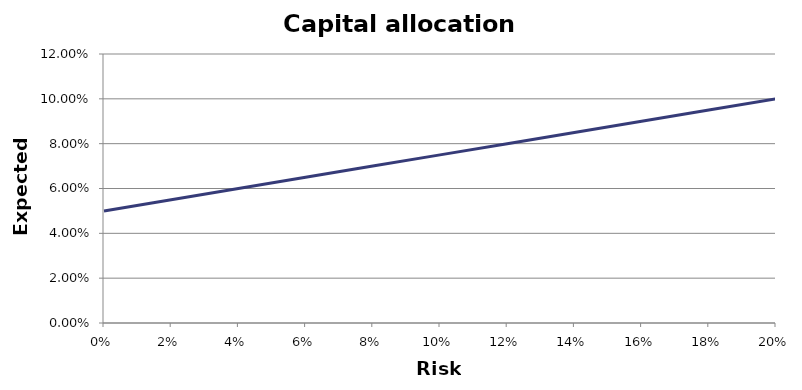
| Category | Expected return |
|---|---|
| 0.0 | 0.05 |
| 0.020000000000000004 | 0.055 |
| 0.04000000000000001 | 0.06 |
| 0.06 | 0.065 |
| 0.08000000000000002 | 0.07 |
| 0.1 | 0.075 |
| 0.12 | 0.08 |
| 0.13999999999999999 | 0.085 |
| 0.16000000000000003 | 0.09 |
| 0.18000000000000002 | 0.095 |
| 0.2 | 0.1 |